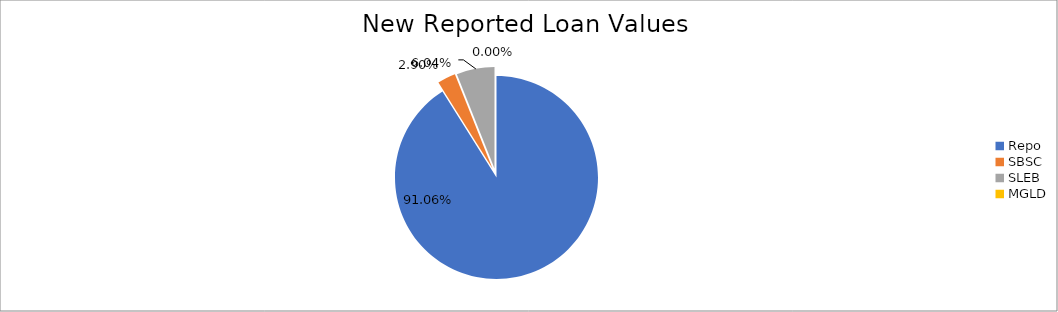
| Category | Series 0 |
|---|---|
| Repo | 8776481.043 |
| SBSC | 279769.234 |
| SLEB | 582185.883 |
| MGLD | 35.769 |